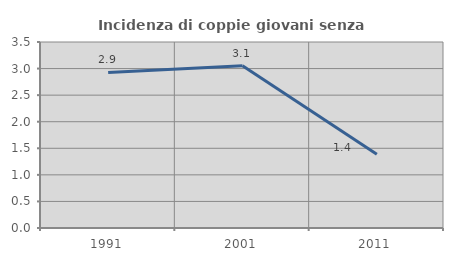
| Category | Incidenza di coppie giovani senza figli |
|---|---|
| 1991.0 | 2.926 |
| 2001.0 | 3.054 |
| 2011.0 | 1.387 |